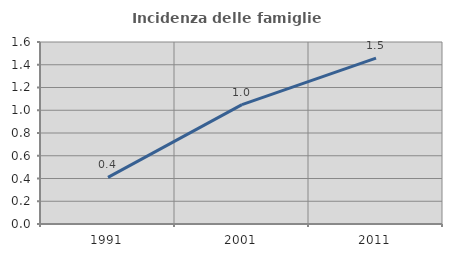
| Category | Incidenza delle famiglie numerose |
|---|---|
| 1991.0 | 0.41 |
| 2001.0 | 1.049 |
| 2011.0 | 1.458 |